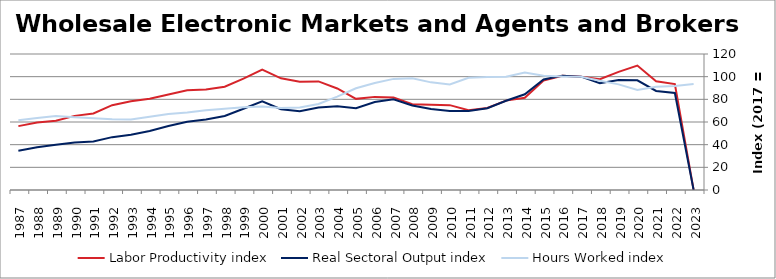
| Category | Labor Productivity index | Real Sectoral Output index | Hours Worked index |
|---|---|---|---|
| 2023.0 | 0 | 0 | 93.441 |
| 2022.0 | 93.42 | 85.642 | 91.675 |
| 2021.0 | 95.957 | 87.396 | 91.079 |
| 2020.0 | 109.8 | 96.824 | 88.182 |
| 2019.0 | 104.198 | 97.106 | 93.193 |
| 2018.0 | 97.79 | 94.282 | 96.413 |
| 2017.0 | 100 | 100 | 100 |
| 2016.0 | 100.792 | 100.903 | 100.111 |
| 2015.0 | 96.686 | 97.512 | 100.854 |
| 2014.0 | 81.411 | 84.436 | 103.716 |
| 2013.0 | 78.85 | 78.756 | 99.88 |
| 2012.0 | 72.383 | 72.13 | 99.651 |
| 2011.0 | 70.483 | 69.752 | 98.964 |
| 2010.0 | 74.888 | 69.794 | 93.198 |
| 2009.0 | 75.235 | 71.456 | 94.977 |
| 2008.0 | 75.665 | 74.578 | 98.563 |
| 2007.0 | 81.679 | 80.084 | 98.047 |
| 2006.0 | 82.166 | 77.591 | 94.433 |
| 2005.0 | 80.413 | 72.218 | 89.81 |
| 2004.0 | 89.584 | 73.818 | 82.401 |
| 2003.0 | 95.822 | 72.764 | 75.937 |
| 2002.0 | 95.583 | 69.556 | 72.77 |
| 2001.0 | 98.547 | 71.282 | 72.332 |
| 2000.0 | 106.196 | 78.193 | 73.631 |
| 1999.0 | 98.256 | 71.725 | 72.997 |
| 1998.0 | 91.118 | 65.315 | 71.681 |
| 1997.0 | 88.622 | 62.294 | 70.291 |
| 1996.0 | 87.983 | 60.149 | 68.365 |
| 1995.0 | 84.225 | 56.409 | 66.974 |
| 1994.0 | 80.577 | 52.043 | 64.587 |
| 1993.0 | 78.365 | 48.745 | 62.202 |
| 1992.0 | 74.851 | 46.647 | 62.32 |
| 1991.0 | 67.516 | 42.806 | 63.401 |
| 1990.0 | 65.408 | 41.969 | 64.164 |
| 1989.0 | 61.042 | 39.842 | 65.269 |
| 1988.0 | 59.488 | 37.753 | 63.462 |
| 1987.0 | 56.355 | 34.628 | 61.445 |